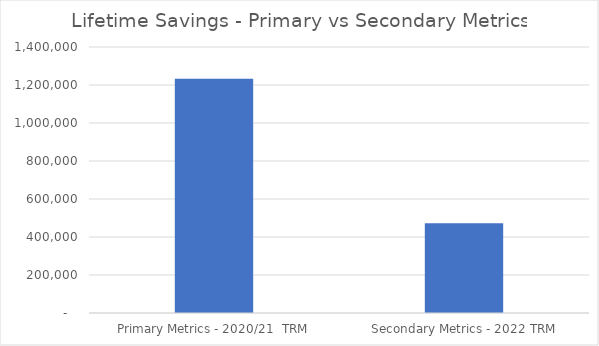
| Category | Series 0 |
|---|---|
|  Primary Metrics - 2020/21  TRM  | 1232768 |
|  Secondary Metrics - 2022 TRM  | 472527.043 |